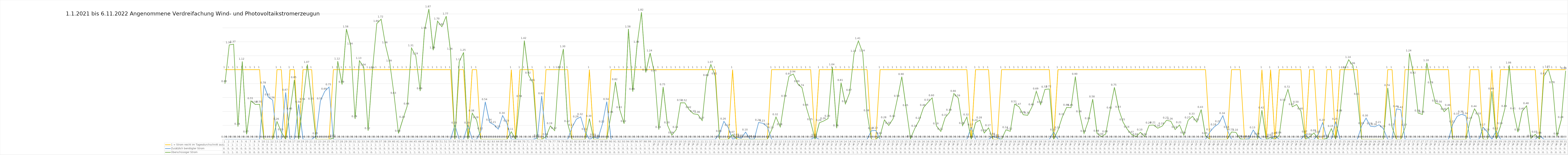
| Category | 1 = Strom reicht im Tagesdurchschnitt aus | Zusätzlich benötigter Strom | Überschüssiger Strom |
|---|---|---|---|
| 0 | 1 | 0 | 0.798 |
| 1 | 1 | 0 | 1.356 |
| 2 | 1 | 0 | 1.366 |
| 3 | 1 | 0 | 0.184 |
| 4 | 1 | 0 | 1.118 |
| 5 | 1 | 0 | 0.073 |
| 6 | 1 | 0 | 0.553 |
| 7 | 1 | 0 | 0.501 |
| 8 | 1 | 0 | 0.503 |
| 9 | 0 | 0.777 | 0 |
| 10 | 0 | 0.606 | 0 |
| 11 | 0 | 0.563 | 0 |
| 12 | 1 | 0 | 0.255 |
| 13 | 1 | 0 | 0.104 |
| 14 | 0 | 0.673 | 0 |
| 15 | 1 | 0 | 0.405 |
| 16 | 1 | 0 | 0.852 |
| 17 | 0 | 0.502 | 0 |
| 18 | 1 | 0 | 0.54 |
| 19 | 1 | 0 | 1.074 |
| 20 | 1 | 0 | 0.546 |
| 21 | 0 | 0.048 | 0 |
| 22 | 0 | 0.55 | 0 |
| 23 | 0 | 0.688 | 0 |
| 24 | 0 | 0.751 | 0 |
| 25 | 1 | 0 | 0.018 |
| 26 | 1 | 0 | 1.121 |
| 27 | 1 | 0 | 0.788 |
| 28 | 1 | 0 | 1.583 |
| 29 | 1 | 0 | 1.338 |
| 30 | 1 | 0 | 0.293 |
| 31 | 1 | 0 | 1.13 |
| 32 | 1 | 0 | 1.037 |
| 33 | 1 | 0 | 0.123 |
| 34 | 1 | 0 | 0.992 |
| 35 | 1 | 0 | 1.662 |
| 36 | 1 | 0 | 1.724 |
| 37 | 1 | 0 | 1.355 |
| 38 | 1 | 0 | 1.094 |
| 39 | 1 | 0 | 0.628 |
| 40 | 1 | 0 | 0.085 |
| 41 | 1 | 0 | 0.286 |
| 42 | 1 | 0 | 0.476 |
| 43 | 1 | 0 | 1.311 |
| 44 | 1 | 0 | 1.194 |
| 45 | 1 | 0 | 0.694 |
| 46 | 1 | 0 | 1.563 |
| 47 | 1 | 0 | 1.87 |
| 48 | 1 | 0 | 1.28 |
| 49 | 1 | 0 | 1.697 |
| 50 | 1 | 0 | 1.616 |
| 51 | 1 | 0 | 1.767 |
| 52 | 1 | 0 | 1.264 |
| 53 | 0 | 0.202 | 0 |
| 54 | 1 | 0 | 1.112 |
| 55 | 1 | 0 | 1.247 |
| 56 | 0 | 0.202 | 0 |
| 57 | 1 | 0 | 0.376 |
| 58 | 1 | 0 | 0.278 |
| 59 | 0 | 0.118 | 0 |
| 60 | 0 | 0.538 | 0 |
| 61 | 0 | 0.244 | 0 |
| 62 | 0 | 0.209 | 0 |
| 63 | 0 | 0.147 | 0 |
| 64 | 0 | 0.341 | 0 |
| 65 | 0 | 0.231 | 0 |
| 66 | 1 | 0 | 0.11 |
| 67 | 0 | 0.003 | 0 |
| 68 | 1 | 0 | 0.584 |
| 69 | 1 | 0 | 1.417 |
| 70 | 1 | 0 | 0.92 |
| 71 | 1 | 0 | 0.813 |
| 72 | 0 | 0.019 | 0 |
| 73 | 0 | 0.624 | 0 |
| 74 | 1 | 0 | 0.038 |
| 75 | 1 | 0 | 0.193 |
| 76 | 1 | 0 | 0.125 |
| 77 | 1 | 0 | 0.999 |
| 78 | 1 | 0 | 1.297 |
| 79 | 1 | 0 | 0.224 |
| 80 | 0 | 0.171 | 0 |
| 81 | 0 | 0.289 | 0 |
| 82 | 0 | 0.323 | 0 |
| 83 | 0 | 0.11 | 0 |
| 84 | 1 | 0 | 0.298 |
| 85 | 0 | 0.032 | 0 |
| 86 | 0 | 0.013 | 0 |
| 87 | 0 | 0.22 | 0 |
| 88 | 0 | 0.541 | 0 |
| 89 | 1 | 0 | 0.357 |
| 90 | 1 | 0 | 0.825 |
| 91 | 1 | 0 | 0.425 |
| 92 | 1 | 0 | 0.225 |
| 93 | 1 | 0 | 1.583 |
| 94 | 1 | 0 | 0.686 |
| 95 | 1 | 0 | 1.361 |
| 96 | 1 | 0 | 1.824 |
| 97 | 1 | 0 | 0.96 |
| 98 | 1 | 0 | 1.239 |
| 99 | 1 | 0 | 0.951 |
| 100 | 1 | 0 | 0.14 |
| 101 | 1 | 0 | 0.751 |
| 102 | 1 | 0 | 0.205 |
| 103 | 1 | 0 | 0.06 |
| 104 | 1 | 0 | 0.138 |
| 105 | 1 | 0 | 0.525 |
| 106 | 1 | 0 | 0.524 |
| 107 | 1 | 0 | 0.425 |
| 108 | 1 | 0 | 0.366 |
| 109 | 1 | 0 | 0.357 |
| 110 | 1 | 0 | 0.269 |
| 111 | 1 | 0 | 0.884 |
| 112 | 1 | 0 | 1.074 |
| 113 | 1 | 0 | 0.908 |
| 114 | 0 | 0.082 | 0 |
| 115 | 0 | 0.258 | 0 |
| 116 | 0 | 0.168 | 0 |
| 117 | 1 | 0 | 0.068 |
| 118 | 0 | 0.031 | 0 |
| 119 | 0 | 0.016 | 0 |
| 120 | 0 | 0.104 | 0 |
| 121 | 0 | 0.005 | 0 |
| 122 | 0 | 0.003 | 0 |
| 123 | 0 | 0.242 | 0 |
| 124 | 0 | 0.23 | 0 |
| 125 | 0 | 0.181 | 0 |
| 126 | 1 | 0 | 0.134 |
| 127 | 1 | 0 | 0.321 |
| 128 | 1 | 0 | 0.178 |
| 129 | 1 | 0 | 0.585 |
| 130 | 1 | 0 | 0.906 |
| 131 | 1 | 0 | 0.937 |
| 132 | 1 | 0 | 0.798 |
| 133 | 1 | 0 | 0.741 |
| 134 | 1 | 0 | 0.458 |
| 135 | 1 | 0 | 0.25 |
| 136 | 0 | 0.03 | 0 |
| 137 | 1 | 0 | 0.238 |
| 138 | 1 | 0 | 0.263 |
| 139 | 1 | 0 | 0.298 |
| 140 | 1 | 0 | 1.04 |
| 141 | 1 | 0 | 0.161 |
| 142 | 1 | 0 | 0.812 |
| 143 | 1 | 0 | 0.509 |
| 144 | 1 | 0 | 0.672 |
| 145 | 1 | 0 | 1.232 |
| 146 | 1 | 0 | 1.413 |
| 147 | 1 | 0 | 1.238 |
| 148 | 1 | 0 | 0.379 |
| 149 | 0 | 0.123 | 0 |
| 150 | 0 | 0.129 | 0 |
| 151 | 1 | 0 | 0.052 |
| 152 | 1 | 0 | 0.279 |
| 153 | 1 | 0 | 0.199 |
| 154 | 1 | 0 | 0.296 |
| 155 | 1 | 0 | 0.585 |
| 156 | 1 | 0 | 0.899 |
| 157 | 1 | 0 | 0.452 |
| 158 | 1 | 0 | 0.009 |
| 159 | 1 | 0 | 0.156 |
| 160 | 1 | 0 | 0.272 |
| 161 | 1 | 0 | 0.456 |
| 162 | 1 | 0 | 0.528 |
| 163 | 1 | 0 | 0.595 |
| 164 | 1 | 0 | 0.191 |
| 165 | 1 | 0 | 0.114 |
| 166 | 1 | 0 | 0.312 |
| 167 | 1 | 0 | 0.386 |
| 168 | 1 | 0 | 0.659 |
| 169 | 1 | 0 | 0.592 |
| 170 | 1 | 0 | 0.196 |
| 171 | 1 | 0 | 0.32 |
| 172 | 0 | 0.174 | 0 |
| 173 | 1 | 0 | 0.24 |
| 174 | 1 | 0 | 0.276 |
| 175 | 1 | 0 | 0.09 |
| 176 | 1 | 0 | 0.165 |
| 177 | 0 | 0.041 | 0 |
| 178 | 0 | 0.023 | 0 |
| 179 | 1 | 0 | 0 |
| 180 | 1 | 0 | 0.136 |
| 181 | 1 | 0 | 0.116 |
| 182 | 1 | 0 | 0.505 |
| 183 | 1 | 0 | 0.468 |
| 184 | 1 | 0 | 0.354 |
| 185 | 1 | 0 | 0.345 |
| 186 | 1 | 0 | 0.464 |
| 187 | 1 | 0 | 0.69 |
| 188 | 1 | 0 | 0.498 |
| 189 | 1 | 0 | 0.717 |
| 190 | 1 | 0 | 0.723 |
| 191 | 0 | 0.104 | 0 |
| 192 | 1 | 0 | 0.132 |
| 193 | 1 | 0 | 0.323 |
| 194 | 1 | 0 | 0.459 |
| 195 | 1 | 0 | 0.454 |
| 196 | 1 | 0 | 0.901 |
| 197 | 1 | 0 | 0.364 |
| 198 | 1 | 0 | 0.084 |
| 199 | 1 | 0 | 0.264 |
| 200 | 1 | 0 | 0.577 |
| 201 | 1 | 0 | 0.085 |
| 202 | 1 | 0 | 0.039 |
| 203 | 1 | 0 | 0.077 |
| 204 | 1 | 0 | 0.418 |
| 205 | 1 | 0 | 0.746 |
| 206 | 1 | 0 | 0.431 |
| 207 | 1 | 0 | 0.247 |
| 208 | 1 | 0 | 0.142 |
| 209 | 1 | 0 | 0.068 |
| 210 | 1 | 0 | 0.037 |
| 211 | 1 | 0 | 0.102 |
| 212 | 1 | 0 | 0.038 |
| 213 | 1 | 0 | 0.202 |
| 214 | 1 | 0 | 0.206 |
| 215 | 1 | 0 | 0.16 |
| 216 | 1 | 0 | 0.19 |
| 217 | 1 | 0 | 0.274 |
| 218 | 1 | 0 | 0.26 |
| 219 | 1 | 0 | 0.14 |
| 220 | 1 | 0 | 0.206 |
| 221 | 1 | 0 | 0.061 |
| 222 | 1 | 0 | 0.275 |
| 223 | 1 | 0 | 0.331 |
| 224 | 1 | 0 | 0.247 |
| 225 | 1 | 0 | 0.427 |
| 226 | 1 | 0 | 0.051 |
| 227 | 0 | 0.105 | 0 |
| 228 | 0 | 0.177 | 0 |
| 229 | 0 | 0.223 | 0 |
| 230 | 0 | 0.339 | 0 |
| 231 | 0 | 0.139 | 0 |
| 232 | 1 | 0 | 0.105 |
| 233 | 1 | 0 | 0.1 |
| 234 | 1 | 0 | 0.009 |
| 235 | 0 | 0.004 | 0 |
| 236 | 0 | 0.007 | 0 |
| 237 | 0 | 0.133 | 0 |
| 238 | 0 | 0.044 | 0 |
| 239 | 1 | 0 | 0.418 |
| 240 | 0 | 0.001 | 0 |
| 241 | 1 | 0 | 0.028 |
| 242 | 0 | 0.05 | 0 |
| 243 | 1 | 0 | 0.059 |
| 244 | 1 | 0 | 0.528 |
| 245 | 1 | 0 | 0.716 |
| 246 | 1 | 0 | 0.467 |
| 247 | 1 | 0 | 0.5 |
| 248 | 1 | 0 | 0.404 |
| 249 | 0 | 0.074 | 0 |
| 250 | 1 | 0 | 0.037 |
| 251 | 1 | 0 | 0.092 |
| 252 | 0 | 0.073 | 0 |
| 253 | 0 | 0.24 | 0 |
| 254 | 1 | 0 | 0.014 |
| 255 | 1 | 0 | 0.154 |
| 256 | 0 | 0.255 | 0 |
| 257 | 1 | 0 | 0.376 |
| 258 | 1 | 0 | 0.994 |
| 259 | 1 | 0 | 1.143 |
| 260 | 1 | 0 | 1.055 |
| 261 | 1 | 0 | 0.613 |
| 262 | 0 | 0.194 | 0 |
| 263 | 0 | 0.304 | 0 |
| 264 | 0 | 0.19 | 0 |
| 265 | 0 | 0.18 | 0 |
| 266 | 0 | 0.209 | 0 |
| 267 | 0 | 0.152 | 0 |
| 268 | 1 | 0 | 0.738 |
| 269 | 1 | 0 | 0.175 |
| 270 | 0 | 0.438 | 0 |
| 271 | 0 | 0.424 | 0 |
| 272 | 1 | 0 | 0.17 |
| 273 | 1 | 0 | 1.237 |
| 274 | 1 | 0 | 0.92 |
| 275 | 1 | 0 | 0.377 |
| 276 | 1 | 0 | 0.358 |
| 277 | 1 | 0 | 1.098 |
| 278 | 1 | 0 | 0.778 |
| 279 | 1 | 0 | 0.518 |
| 280 | 1 | 0 | 0.504 |
| 281 | 1 | 0 | 0.397 |
| 282 | 1 | 0 | 0.456 |
| 283 | 0 | 0.219 | 0 |
| 284 | 0 | 0.33 | 0 |
| 285 | 0 | 0.36 | 0 |
| 286 | 0 | 0.337 | 0 |
| 287 | 1 | 0 | 0.271 |
| 288 | 1 | 0 | 0.438 |
| 289 | 1 | 0 | 0.332 |
| 290 | 0 | 0.173 | 0 |
| 291 | 0 | 0.102 | 0 |
| 292 | 1 | 0 | 0.69 |
| 293 | 0 | 0.12 | 0 |
| 294 | 1 | 0 | 0.192 |
| 295 | 1 | 0 | 0.441 |
| 296 | 1 | 0 | 1.063 |
| 297 | 1 | 0 | 0.407 |
| 298 | 1 | 0 | 0.104 |
| 299 | 1 | 0 | 0.405 |
| 300 | 1 | 0 | 0.481 |
| 301 | 1 | 0 | 0.015 |
| 302 | 1 | 0 | 0.072 |
| 303 | 0 | 0.056 | 0 |
| 304 | 1 | 0 | 0.908 |
| 305 | 1 | 0 | 1.007 |
| 306 | 1 | 0 | 0.783 |
| 307 | 1 | 0 | 0.045 |
| 308 | 1 | 0 | 0.282 |
| 309 | 1 | 0 | 0.983 |